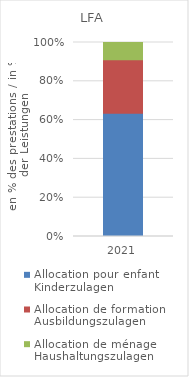
| Category | Allocation pour enfant | Allocation de formation | Allocation de ménage |
|---|---|---|---|
| 2021.0 | 0.635 | 0.276 | 0.088 |